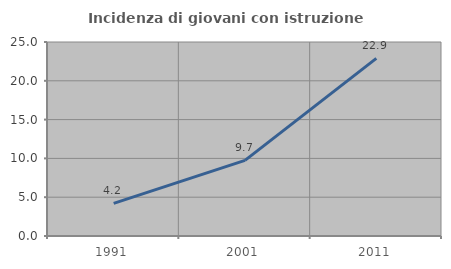
| Category | Incidenza di giovani con istruzione universitaria |
|---|---|
| 1991.0 | 4.206 |
| 2001.0 | 9.748 |
| 2011.0 | 22.896 |